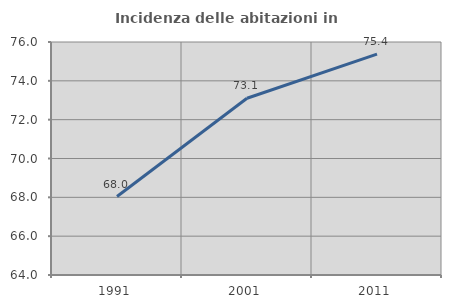
| Category | Incidenza delle abitazioni in proprietà  |
|---|---|
| 1991.0 | 68.039 |
| 2001.0 | 73.102 |
| 2011.0 | 75.376 |